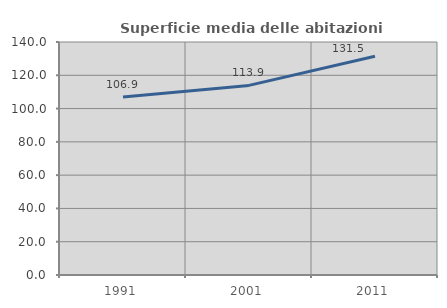
| Category | Superficie media delle abitazioni occupate |
|---|---|
| 1991.0 | 106.946 |
| 2001.0 | 113.916 |
| 2011.0 | 131.472 |